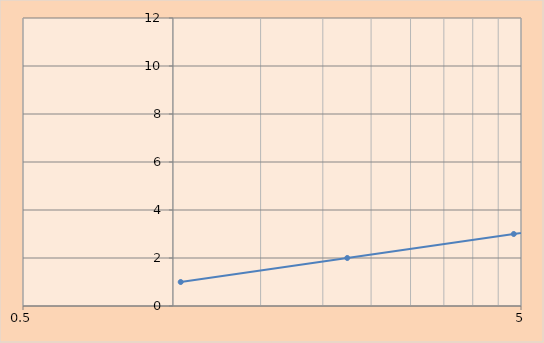
| Category | yval |
|---|---|
| 1.03668780181676 | 1 |
| 2.2390033300743 | 2 |
| 4.83572383440652 | 3 |
| 10.4440331501746 | 4 |
| 22.5566703511581 | 5 |
| 48.7171354221819 | 6 |
| 105.217625065898 | 7 |
| 227.245475920721 | 8 |
| 490.797110218865 | 9 |
| 1060.00703610586 | 10 |
| 2289.36742535601 | 11 |